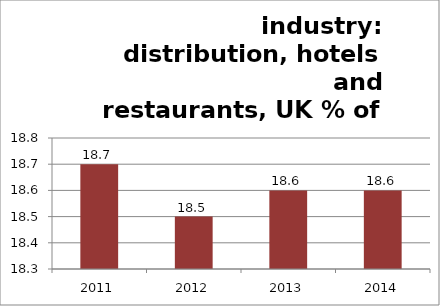
| Category | G,I: Distribution, hotels & restaurants |
|---|---|
| 2011.0 | 18.7 |
| 2012.0 | 18.5 |
| 2013.0 | 18.6 |
| 2014.0 | 18.6 |